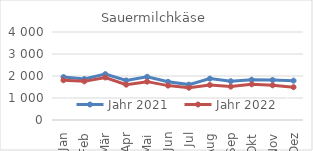
| Category | Jahr 2021 | Jahr 2022 |
|---|---|---|
| Jan | 1952.061 | 1806.77 |
| Feb | 1863.918 | 1756.801 |
| Mär | 2085.775 | 1932.28 |
| Apr | 1797.209 | 1605.842 |
| Mai | 1965.186 | 1743.215 |
| Jun | 1735.152 | 1563.197 |
| Jul | 1609.218 | 1466.294 |
| Aug | 1881.806 | 1592.016 |
| Sep | 1762.028 | 1518.043 |
| Okt | 1829.623 | 1621.815 |
| Nov | 1816.752 | 1577.328 |
| Dez | 1788.598 | 1492.672 |